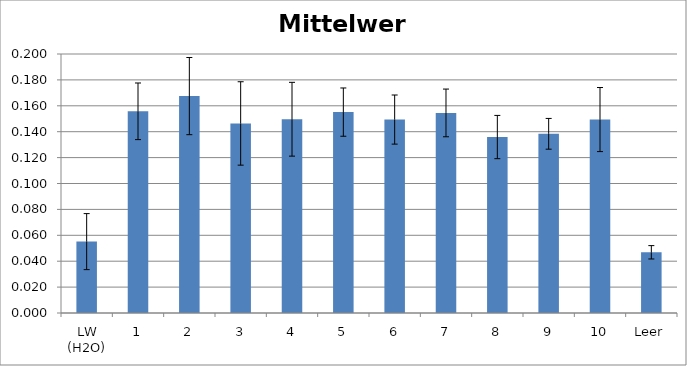
| Category | Mittelwert |
|---|---|
| LW (H2O) | 0.055 |
| 1 | 0.156 |
| 2 | 0.168 |
| 3 | 0.146 |
| 4 | 0.15 |
| 5 | 0.155 |
| 6 | 0.149 |
| 7 | 0.155 |
| 8 | 0.136 |
| 9 | 0.138 |
| 10 | 0.149 |
| Leer | 0.047 |